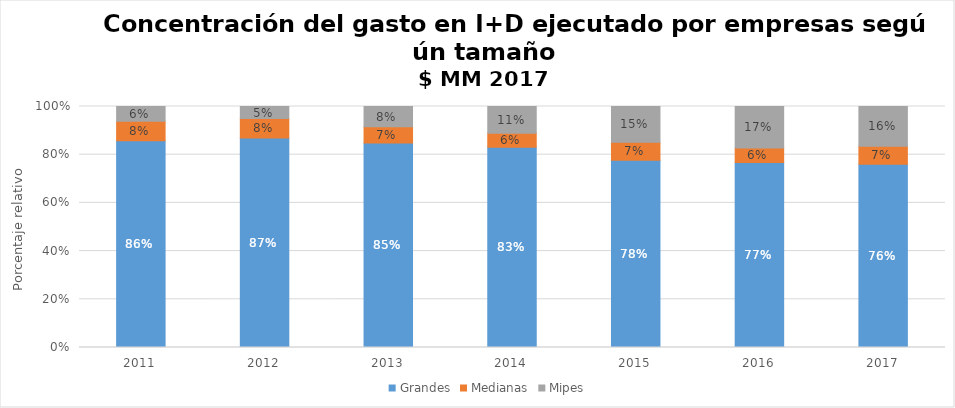
| Category | Grandes | Medianas | Mipes |
|---|---|---|---|
| 2011.0 | 0.858 | 0.081 | 0.061 |
| 2012.0 | 0.87 | 0.08 | 0.05 |
| 2013.0 | 0.849 | 0.067 | 0.084 |
| 2014.0 | 0.831 | 0.058 | 0.111 |
| 2015.0 | 0.777 | 0.075 | 0.148 |
| 2016.0 | 0.768 | 0.06 | 0.172 |
| 2017.0 | 0.761 | 0.074 | 0.165 |